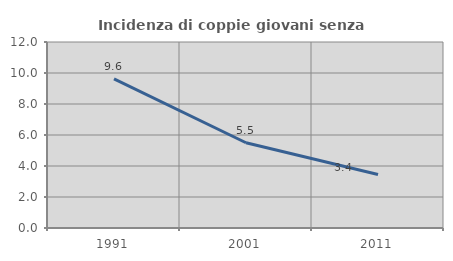
| Category | Incidenza di coppie giovani senza figli |
|---|---|
| 1991.0 | 9.623 |
| 2001.0 | 5.499 |
| 2011.0 | 3.448 |